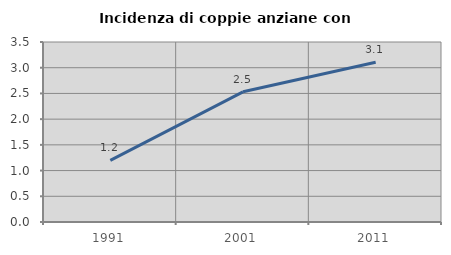
| Category | Incidenza di coppie anziane con figli |
|---|---|
| 1991.0 | 1.198 |
| 2001.0 | 2.532 |
| 2011.0 | 3.106 |